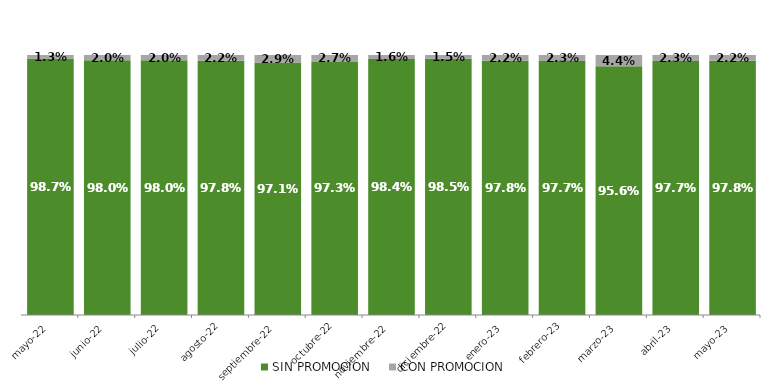
| Category | SIN PROMOCION   | CON PROMOCION   |
|---|---|---|
| 2022-05-01 | 0.987 | 0.013 |
| 2022-06-01 | 0.98 | 0.02 |
| 2022-07-01 | 0.98 | 0.02 |
| 2022-08-01 | 0.978 | 0.022 |
| 2022-09-01 | 0.971 | 0.029 |
| 2022-10-01 | 0.973 | 0.027 |
| 2022-11-01 | 0.984 | 0.016 |
| 2022-12-01 | 0.985 | 0.015 |
| 2023-01-01 | 0.978 | 0.022 |
| 2023-02-01 | 0.977 | 0.023 |
| 2023-03-01 | 0.956 | 0.044 |
| 2023-04-01 | 0.977 | 0.023 |
| 2023-05-01 | 0.978 | 0.022 |